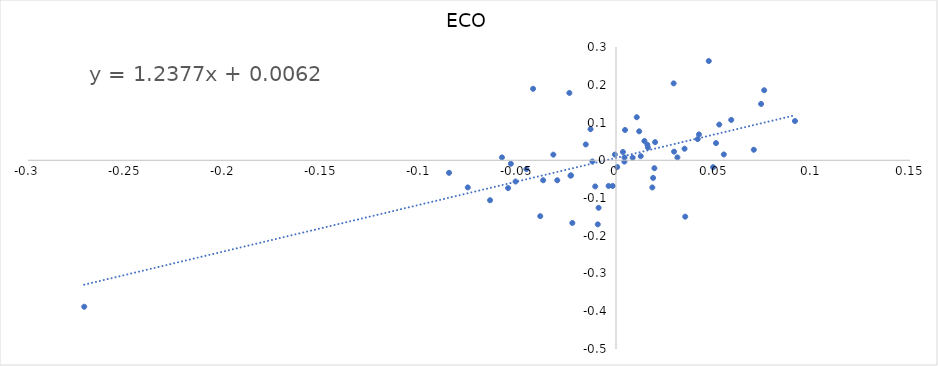
| Category | ECO |
|---|---|
| 0.07031166163327263 | 0.028 |
| -0.064260393167902 | -0.106 |
| 0.018926696361604822 | -0.047 |
| -0.010598264919067013 | -0.069 |
| -0.053634872916097365 | -0.009 |
| -0.0222767710313736 | -0.166 |
| -0.0005661213304670731 | 0.015 |
| -0.0851879520248251 | -0.033 |
| 0.03531174844753959 | -0.149 |
| 0.018531520052699424 | -0.072 |
| 0.05878698652869163 | 0.107 |
| 0.07402525378364677 | 0.149 |
| 0.004602363294843093 | 0.08 |
| -0.03717912426811287 | -0.053 |
| 0.015992139325808008 | 0.041 |
| -0.0037770907263284803 | -0.068 |
| 0.05500603873966159 | 0.015 |
| -0.029959860308075847 | -0.053 |
| 0.01994278586527054 | 0.048 |
| -0.05818986034726448 | 0.008 |
| 0.051015885604982714 | 0.045 |
| 0.0042835582386362425 | -0.004 |
| -0.022954466765379822 | -0.04 |
| 0.029631081722975683 | 0.023 |
| 0.004342381792751926 | 0.007 |
| 0.04953555856919967 | -0.018 |
| 0.01626976408147396 | 0.034 |
| 0.012625606671679446 | 0.011 |
| 0.0006075457178154053 | -0.018 |
| 0.003541864842437681 | 0.022 |
| -0.04231203614069057 | 0.189 |
| 0.014495500428196362 | 0.051 |
| 0.047341945572677124 | 0.263 |
| 0.029418954183595858 | 0.204 |
| -0.05124568406730934 | -0.056 |
| -0.015429572558224414 | 0.042 |
| 0.0756018467626689 | 0.185 |
| -0.012040420041390831 | -0.003 |
| 0.01958996838450644 | -0.021 |
| -0.03196555506940357 | 0.015 |
| 0.010592165596750913 | 0.114 |
| -0.023788380640017648 | 0.178 |
| -0.07562065508243299 | -0.072 |
| -0.009294775100920916 | -0.17 |
| -0.03865172123778304 | -0.148 |
| 0.09131703785267686 | 0.104 |
| 0.04233557473687122 | 0.068 |
| 0.052689505194693176 | 0.095 |
| -0.00888054719286524 | -0.126 |
| -0.05505706514831865 | -0.074 |
| 0.041681237390719605 | 0.056 |
| 0.008489457578535697 | 0.007 |
| -0.0016707956444086403 | -0.068 |
| 0.011824151020827012 | 0.077 |
| 0.03497553803645226 | 0.031 |
| -0.01299941830205431 | 0.082 |
| 0.0313290982182739 | 0.008 |
| -0.02321314709880784 | -0.041 |
| -0.04570675501745869 | -0.024 |
| -0.27131342724943686 | -0.388 |